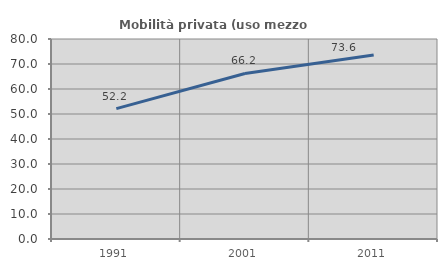
| Category | Mobilità privata (uso mezzo privato) |
|---|---|
| 1991.0 | 52.16 |
| 2001.0 | 66.221 |
| 2011.0 | 73.604 |